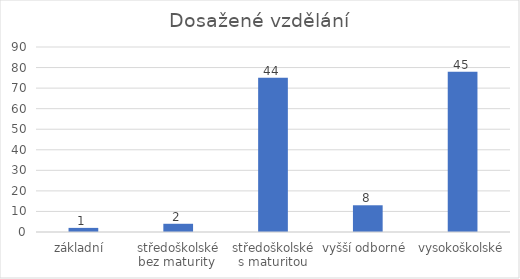
| Category | Počet respondentů |
|---|---|
| základní  | 2 |
| středoškolské bez maturity  | 4 |
| středoškolské s maturitou | 75 |
| vyšší odborné  | 13 |
| vysokoškolské | 78 |